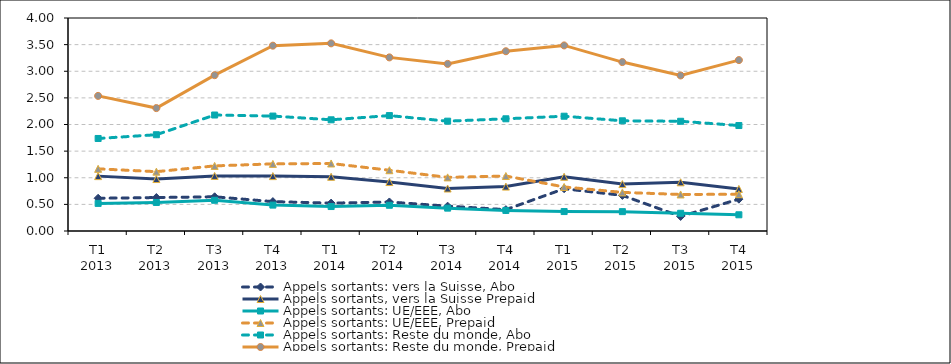
| Category | Appels sortants: vers la Suisse, Abo | Appels sortants, vers la Suisse Prepaid | Appels sortants: UE/EEE, Abo | Appels sortants: UE/EEE, Prepaid | Appels sortants: Reste du monde, Abo | Appels sortants: Reste du monde, Prepaid |
|---|---|---|---|---|---|---|
| T1 2013 | 0.615 | 1.031 | 0.518 | 1.167 | 1.738 | 2.537 |
| T2 2013 | 0.628 | 0.976 | 0.536 | 1.114 | 1.808 | 2.308 |
| T3 2013 | 0.643 | 1.034 | 0.577 | 1.223 | 2.178 | 2.926 |
| T4 2013 | 0.552 | 1.031 | 0.486 | 1.26 | 2.158 | 3.48 |
| T1 2014 | 0.524 | 1.018 | 0.459 | 1.268 | 2.088 | 3.524 |
| T2 2014 | 0.545 | 0.92 | 0.483 | 1.141 | 2.167 | 3.26 |
| T3 2014 | 0.467 | 0.798 | 0.429 | 1.007 | 2.063 | 3.138 |
| T4 2014 | 0.401 | 0.834 | 0.386 | 1.032 | 2.107 | 3.376 |
| T1 2015 | 0.794 | 1.018 | 0.365 | 0.827 | 2.156 | 3.485 |
| T2 2015 | 0.669 | 0.881 | 0.364 | 0.725 | 2.069 | 3.172 |
| T3 2015 | 0.274 | 0.914 | 0.332 | 0.686 | 2.061 | 2.921 |
| T4 2015 | 0.598 | 0.79 | 0.304 | 0.69 | 1.981 | 3.21 |